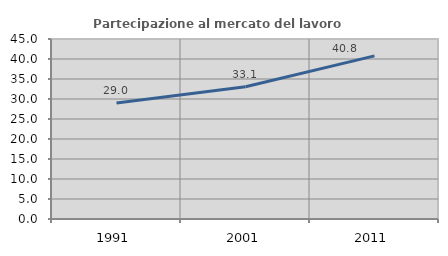
| Category | Partecipazione al mercato del lavoro  femminile |
|---|---|
| 1991.0 | 29.021 |
| 2001.0 | 33.061 |
| 2011.0 | 40.778 |